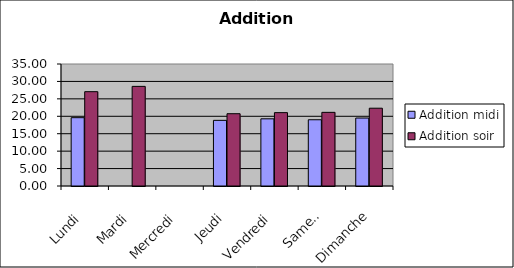
| Category | Addition |
|---|---|
| Lundi | 27.06 |
| Mardi | 28.58 |
| Mercredi | 0 |
| Jeudi | 20.738 |
| Vendredi | 21.048 |
| Samedi | 21.128 |
| Dimanche | 22.316 |